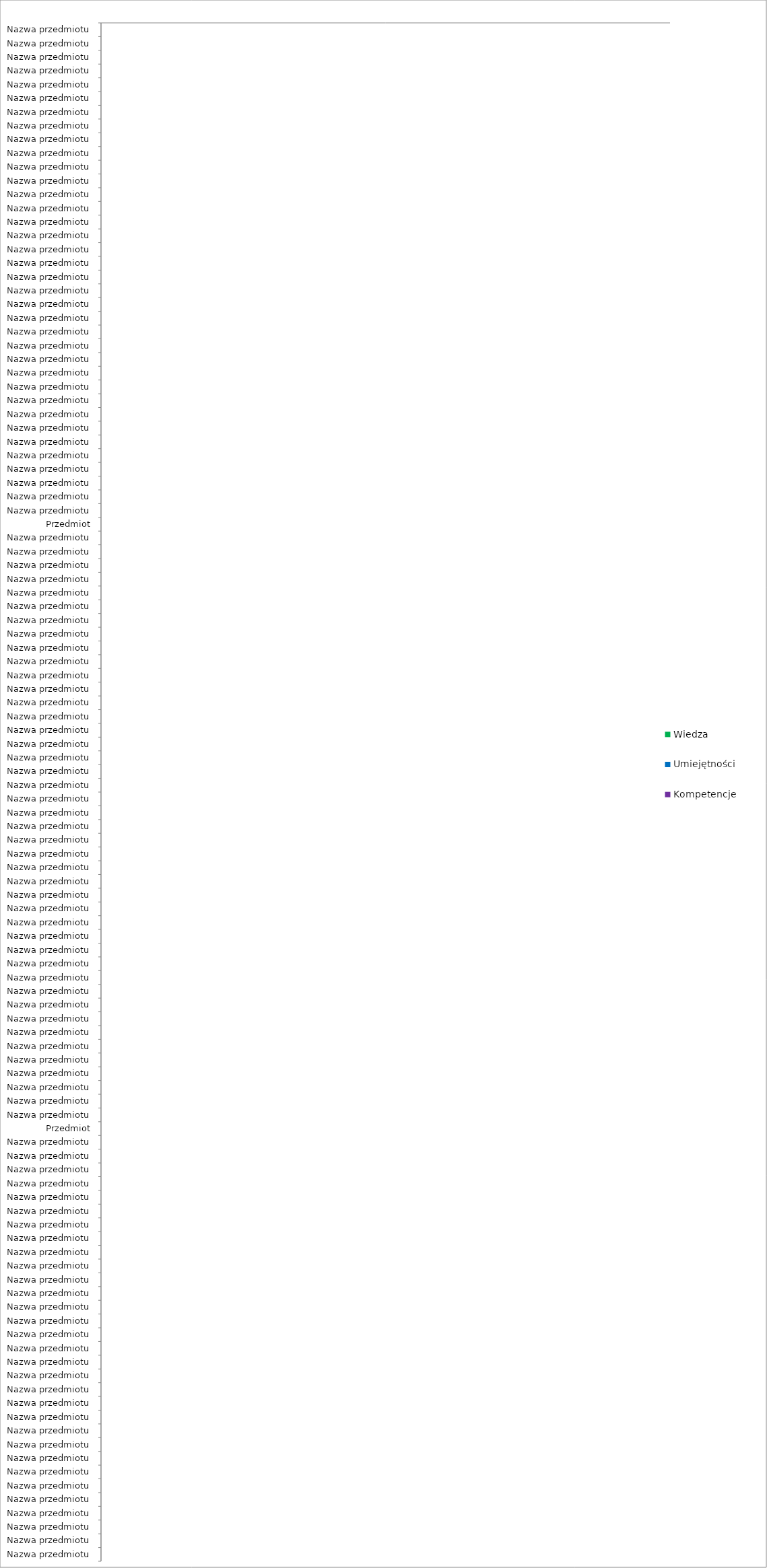
| Category | Wiedza | Umiejętności | Kompetencje |
|---|---|---|---|
| Nazwa przedmiotu | 0 | 0 | 0 |
| Nazwa przedmiotu | 0 | 0 | 0 |
| Nazwa przedmiotu | 0 | 0 | 0 |
| Nazwa przedmiotu | 0 | 0 | 0 |
| Nazwa przedmiotu | 0 | 0 | 0 |
| Nazwa przedmiotu | 0 | 0 | 0 |
| Nazwa przedmiotu | 0 | 0 | 0 |
| Nazwa przedmiotu | 0 | 0 | 0 |
| Nazwa przedmiotu | 0 | 0 | 0 |
| Nazwa przedmiotu | 0 | 0 | 0 |
| Nazwa przedmiotu | 0 | 0 | 0 |
| Nazwa przedmiotu | 0 | 0 | 0 |
| Nazwa przedmiotu | 0 | 0 | 0 |
| Nazwa przedmiotu | 0 | 0 | 0 |
| Nazwa przedmiotu | 0 | 0 | 0 |
| Nazwa przedmiotu | 0 | 0 | 0 |
| Nazwa przedmiotu | 0 | 0 | 0 |
| Nazwa przedmiotu | 0 | 0 | 0 |
| Nazwa przedmiotu | 0 | 0 | 0 |
| Nazwa przedmiotu | 0 | 0 | 0 |
| Nazwa przedmiotu | 0 | 0 | 0 |
| Nazwa przedmiotu | 0 | 0 | 0 |
| Nazwa przedmiotu | 0 | 0 | 0 |
| Nazwa przedmiotu | 0 | 0 | 0 |
| Nazwa przedmiotu | 0 | 0 | 0 |
| Nazwa przedmiotu | 0 | 0 | 0 |
| Nazwa przedmiotu | 0 | 0 | 0 |
| Nazwa przedmiotu | 0 | 0 | 0 |
| Nazwa przedmiotu | 0 | 0 | 0 |
| Nazwa przedmiotu | 0 | 0 | 0 |
| Nazwa przedmiotu | 0 | 0 | 0 |
| Nazwa przedmiotu | 0 | 0 | 0 |
| Nazwa przedmiotu | 0 | 0 | 0 |
| Nazwa przedmiotu | 0 | 0 | 0 |
| Nazwa przedmiotu | 0 | 0 | 0 |
| Nazwa przedmiotu | 0 | 0 | 0 |
| Przedmiot | 0 | 0 | 0 |
| Nazwa przedmiotu | 0 | 0 | 0 |
| Nazwa przedmiotu | 0 | 0 | 0 |
| Nazwa przedmiotu | 0 | 0 | 0 |
| Nazwa przedmiotu | 0 | 0 | 0 |
| Nazwa przedmiotu | 0 | 0 | 0 |
| Nazwa przedmiotu | 0 | 0 | 0 |
| Nazwa przedmiotu | 0 | 0 | 0 |
| Nazwa przedmiotu | 0 | 0 | 0 |
| Nazwa przedmiotu | 0 | 0 | 0 |
| Nazwa przedmiotu | 0 | 0 | 0 |
| Nazwa przedmiotu | 0 | 0 | 0 |
| Nazwa przedmiotu | 0 | 0 | 0 |
| Nazwa przedmiotu | 0 | 0 | 0 |
| Nazwa przedmiotu | 0 | 0 | 0 |
| Nazwa przedmiotu | 0 | 0 | 0 |
| Nazwa przedmiotu | 0 | 0 | 0 |
| Nazwa przedmiotu | 0 | 0 | 0 |
| Nazwa przedmiotu | 0 | 0 | 0 |
| Nazwa przedmiotu | 0 | 0 | 0 |
| Nazwa przedmiotu | 0 | 0 | 0 |
| Nazwa przedmiotu | 0 | 0 | 0 |
| Nazwa przedmiotu | 0 | 0 | 0 |
| Nazwa przedmiotu | 0 | 0 | 0 |
| Nazwa przedmiotu | 0 | 0 | 0 |
| Nazwa przedmiotu | 0 | 0 | 0 |
| Nazwa przedmiotu | 0 | 0 | 0 |
| Nazwa przedmiotu | 0 | 0 | 0 |
| Nazwa przedmiotu | 0 | 0 | 0 |
| Nazwa przedmiotu | 0 | 0 | 0 |
| Nazwa przedmiotu | 0 | 0 | 0 |
| Nazwa przedmiotu | 0 | 0 | 0 |
| Nazwa przedmiotu | 0 | 0 | 0 |
| Nazwa przedmiotu | 0 | 0 | 0 |
| Nazwa przedmiotu | 0 | 0 | 0 |
| Nazwa przedmiotu | 0 | 0 | 0 |
| Nazwa przedmiotu | 0 | 0 | 0 |
| Nazwa przedmiotu | 0 | 0 | 0 |
| Nazwa przedmiotu | 0 | 0 | 0 |
| Nazwa przedmiotu | 0 | 0 | 0 |
| Nazwa przedmiotu | 0 | 0 | 0 |
| Nazwa przedmiotu | 0 | 0 | 0 |
| Nazwa przedmiotu | 0 | 0 | 0 |
| Nazwa przedmiotu | 0 | 0 | 0 |
| Przedmiot | 0 | 0 | 0 |
| Nazwa przedmiotu | 0 | 0 | 0 |
| Nazwa przedmiotu | 0 | 0 | 0 |
| Nazwa przedmiotu | 0 | 0 | 0 |
| Nazwa przedmiotu | 0 | 0 | 0 |
| Nazwa przedmiotu | 0 | 0 | 0 |
| Nazwa przedmiotu | 0 | 0 | 0 |
| Nazwa przedmiotu | 0 | 0 | 0 |
| Nazwa przedmiotu | 0 | 0 | 0 |
| Nazwa przedmiotu | 0 | 0 | 0 |
| Nazwa przedmiotu | 0 | 0 | 0 |
| Nazwa przedmiotu | 0 | 0 | 0 |
| Nazwa przedmiotu | 0 | 0 | 0 |
| Nazwa przedmiotu | 0 | 0 | 0 |
| Nazwa przedmiotu | 0 | 0 | 0 |
| Nazwa przedmiotu | 0 | 0 | 0 |
| Nazwa przedmiotu | 0 | 0 | 0 |
| Nazwa przedmiotu | 0 | 0 | 0 |
| Nazwa przedmiotu | 0 | 0 | 0 |
| Nazwa przedmiotu | 0 | 0 | 0 |
| Nazwa przedmiotu | 0 | 0 | 0 |
| Nazwa przedmiotu | 0 | 0 | 0 |
| Nazwa przedmiotu | 0 | 0 | 0 |
| Nazwa przedmiotu | 0 | 0 | 0 |
| Nazwa przedmiotu | 0 | 0 | 0 |
| Nazwa przedmiotu | 0 | 0 | 0 |
| Nazwa przedmiotu | 0 | 0 | 0 |
| Nazwa przedmiotu | 0 | 0 | 0 |
| Nazwa przedmiotu | 0 | 0 | 0 |
| Nazwa przedmiotu | 0 | 0 | 0 |
| Nazwa przedmiotu | 0 | 0 | 0 |
| Nazwa przedmiotu | 0 | 0 | 0 |